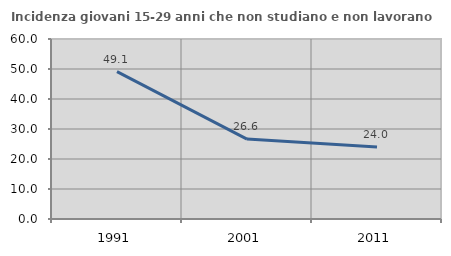
| Category | Incidenza giovani 15-29 anni che non studiano e non lavorano  |
|---|---|
| 1991.0 | 49.11 |
| 2001.0 | 26.644 |
| 2011.0 | 24.029 |